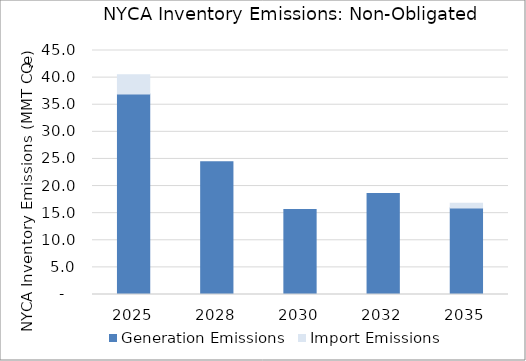
| Category | Generation Emissions  | Import Emissions |
|---|---|---|
| 2025.0 | 37 | 3.53 |
| 2028.0 | 24.46 | 0 |
| 2030.0 | 15.67 | 0 |
| 2032.0 | 18.63 | 0 |
| 2035.0 | 15.97 | 0.84 |